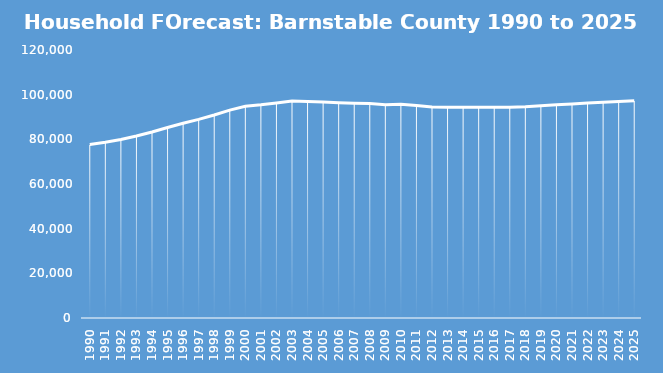
| Category | Households |
|---|---|
| 1990.0 | 77675 |
| 1991.0 | 78670.952 |
| 1992.0 | 79936.602 |
| 1993.0 | 81513.072 |
| 1994.0 | 83314.243 |
| 1995.0 | 85325.439 |
| 1996.0 | 87184.228 |
| 1997.0 | 88936.89 |
| 1998.0 | 90923.111 |
| 1999.0 | 93081.579 |
| 2000.0 | 94845 |
| 2001.0 | 95450.661 |
| 2002.0 | 96313.23 |
| 2003.0 | 97116.855 |
| 2004.0 | 96913.51 |
| 2005.0 | 96685.635 |
| 2006.0 | 96344.598 |
| 2007.0 | 96141.713 |
| 2008.0 | 96000.595 |
| 2009.0 | 95533.807 |
| 2010.0 | 95755 |
| 2011.0 | 95133.728 |
| 2012.0 | 94530.562 |
| 2013.0 | 94393.633 |
| 2014.0 | 94371 |
| 2015.0 | 94417 |
| 2016.0 | 94391.891 |
| 2017.0 | 94412.181 |
| 2018.0 | 94601.344 |
| 2019.0 | 94999.119 |
| 2020.0 | 95452.719 |
| 2021.0 | 95842.804 |
| 2022.0 | 96222.681 |
| 2023.0 | 96596.259 |
| 2024.0 | 96960.152 |
| 2025.0 | 97284.188 |